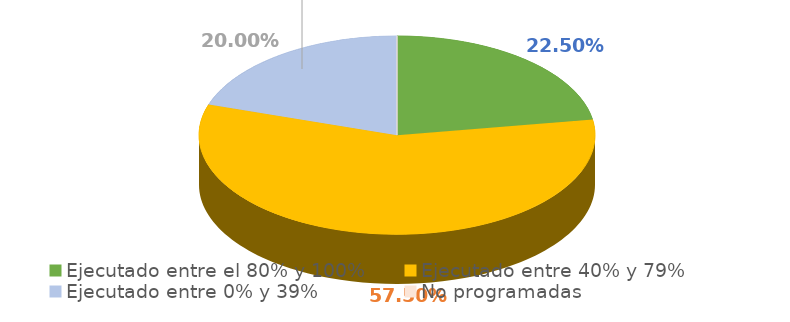
| Category | Series 0 |
|---|---|
| Ejecutado entre el 80% y 100% | 0.225 |
| Ejecutado entre 40% y 79% | 0.575 |
| Ejecutado entre 0% y 39% | 0.2 |
| No programadas | 0 |